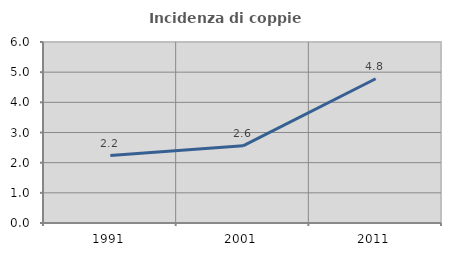
| Category | Incidenza di coppie miste |
|---|---|
| 1991.0 | 2.237 |
| 2001.0 | 2.559 |
| 2011.0 | 4.783 |